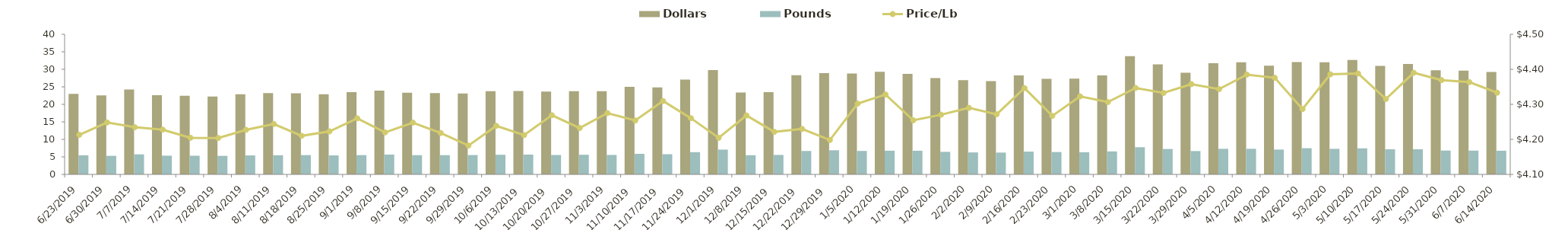
| Category | Dollars | Pounds |
|---|---|---|
| 6/23/19 | 22962498.82 | 5450429.1 |
| 6/30/19 | 22530226.99 | 5303478.4 |
| 7/7/19 | 24258511.23 | 5728583.58 |
| 7/14/19 | 22591442.57 | 5343506.71 |
| 7/21/19 | 22428163.99 | 5334310.9 |
| 7/28/19 | 22255363.43 | 5293814.79 |
| 8/4/19 | 22906285.65 | 5418811.3 |
| 8/11/19 | 23205909.96 | 5468018.27 |
| 8/18/19 | 23170603.19 | 5503578.12 |
| 8/25/19 | 22901350.88 | 5423196.62 |
| 9/1/19 | 23460492.3 | 5507152.63 |
| 9/8/19 | 23890700.51 | 5661442.12 |
| 9/15/19 | 23341472.71 | 5494965.12 |
| 9/22/19 | 23189304.52 | 5497431.53 |
| 9/29/19 | 23118214.93 | 5527635.22 |
| 10/6/19 | 23746805.41 | 5602609.62 |
| 10/13/19 | 23817400.89 | 5654393.55 |
| 10/20/19 | 23637360.4 | 5537104.86 |
| 10/27/19 | 23734372.24 | 5607688.8 |
| 11/3/19 | 23742873.18 | 5553958.88 |
| 11/10/19 | 24991644.16 | 5875080.22 |
| 11/17/19 | 24820568.9 | 5759541.41 |
| 11/24/19 | 27058174.97 | 6350838.95 |
| 12/1/19 | 29756168.69 | 7077351.52 |
| 12/8/19 | 23394114.62 | 5480906.96 |
| 12/15/19 | 23459392.81 | 5557112.17 |
| 12/22/19 | 28288213.88 | 6687756.68 |
| 12/29/19 | 28915629.55 | 6887566.93 |
| 1/5/20 | 28814038.86 | 6697620.31 |
| 1/12/20 | 29288938.68 | 6767260.99 |
| 1/19/20 | 28702513.54 | 6746584.85 |
| 1/26/20 | 27487452.39 | 6436782.74 |
| 2/2/20 | 26906691.69 | 6272102.92 |
| 2/9/20 | 26627858.01 | 6233797.28 |
| 2/16/20 | 28284188.88 | 6507635.51 |
| 2/23/20 | 27259857.07 | 6388508.16 |
| 3/1/20 | 27337430.87 | 6324120.25 |
| 3/8/20 | 28263505.37 | 6563055.98 |
| 3/15/20 | 33727658.41 | 7759315.16 |
| 3/22/20 | 31423835.83 | 7253043.29 |
| 3/29/20 | 29029095.91 | 6661585.94 |
| 4/5/20 | 31733878.89 | 7306179.73 |
| 4/12/20 | 32035129.66 | 7305782.09 |
| 4/19/20 | 31028727.66 | 7090904.94 |
| 4/26/20 | 32070575.77 | 7481912.89 |
| 5/3/20 | 32005482.09 | 7297459.39 |
| 5/10/20 | 32660551.09 | 7443073.51 |
| 5/17/20 | 30980353.81 | 7179289.82 |
| 5/24/20 | 31508259.54 | 7177046.14 |
| 5/31/20 | 29714782.46 | 6801007.03 |
| 6/7/20 | 29625246.12 | 6789190.48 |
| 6/14/20 | 29263932.18 | 6753332.36 |